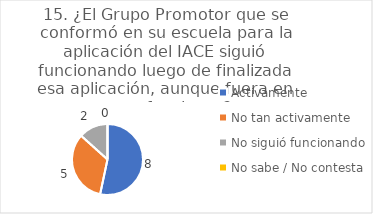
| Category | 15. ¿El Grupo Promotor que se conformó en su escuela para la aplicación del IACE siguió funcionando luego de finalizada esa aplicación, aunque fuera en otras funciones? |
|---|---|
| Activamente  | 0.533 |
| No tan activamente  | 0.333 |
| No siguió funcionando  | 0.133 |
| No sabe / No contesta | 0 |